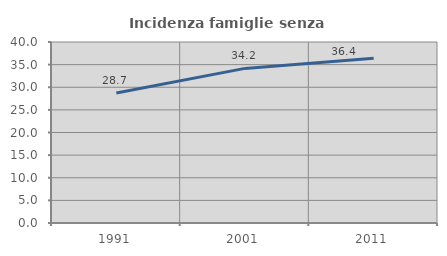
| Category | Incidenza famiglie senza nuclei |
|---|---|
| 1991.0 | 28.719 |
| 2001.0 | 34.17 |
| 2011.0 | 36.435 |